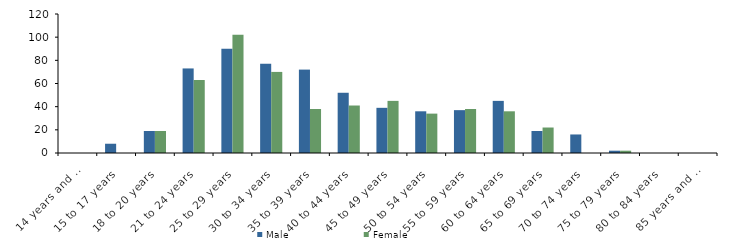
| Category | Male | Female |
|---|---|---|
| 14 years and under | 0 | 0 |
| 15 to 17 years | 8 | 0 |
| 18 to 20 years | 19 | 19 |
| 21 to 24 years | 73 | 63 |
| 25 to 29 years | 90 | 102 |
| 30 to 34 years | 77 | 70 |
| 35 to 39 years | 72 | 38 |
| 40 to 44 years | 52 | 41 |
| 45 to 49 years | 39 | 45 |
| 50 to 54 years | 36 | 34 |
| 55 to 59 years | 37 | 38 |
| 60 to 64 years | 45 | 36 |
| 65 to 69 years | 19 | 22 |
| 70 to 74 years | 16 | 0 |
| 75 to 79 years | 2 | 2 |
| 80 to 84 years | 0 | 0 |
| 85 years and over | 0 | 0 |